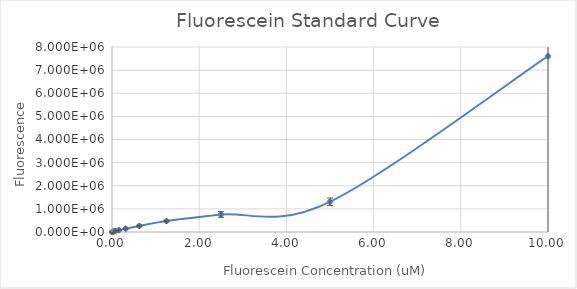
| Category | Series 0 |
|---|---|
| 10.0 | 7605601.25 |
| 5.0 | 1305235.75 |
| 2.5 | 756407.25 |
| 1.25 | 474005.75 |
| 0.625 | 260146.5 |
| 0.3125 | 146297.25 |
| 0.15625 | 78891.75 |
| 0.078125 | 43609.25 |
| 0.0390625 | 23591.25 |
| 0.01953125 | 12827 |
| 0.009765625 | 8301.75 |
| 0.0 | 0 |